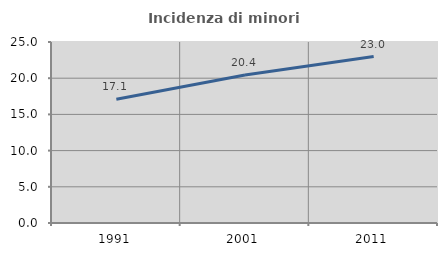
| Category | Incidenza di minori stranieri |
|---|---|
| 1991.0 | 17.105 |
| 2001.0 | 20.436 |
| 2011.0 | 22.991 |